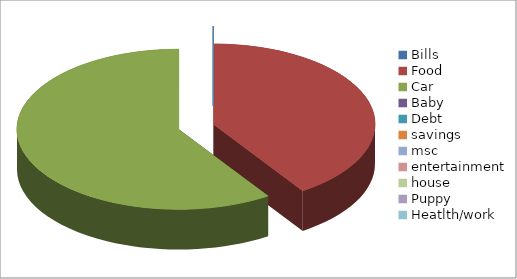
| Category | Series 0 |
|---|---|
| Bills | 0 |
| Food | 23.99 |
| Car | 35 |
| Baby  | 0 |
| Debt | 0 |
| savings | 0 |
| msc | 0 |
| entertainment | 0 |
| house | 0 |
| Puppy | 0 |
| Heatlth/work | 0 |